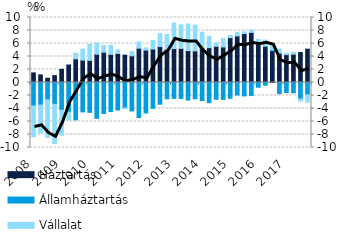
| Category | Háztartás | Államháztartás | Vállalat |
|---|---|---|---|
| 2008.0 | 1.482 | -3.614 | -4.726 |
| 2008.0 | 1.167 | -3.465 | -4.286 |
| 2008.0 | 0.647 | -2.667 | -5.769 |
| 2008.0 | 1.06 | -3.365 | -6.035 |
| 2009.0 | 2.022 | -4.26 | -3.85 |
| 2009.0 | 2.69 | -4.568 | -1.185 |
| 2009.0 | 3.646 | -5.737 | 0.861 |
| 2009.0 | 3.452 | -4.523 | 1.684 |
| 2010.0 | 3.403 | -4.596 | 2.463 |
| 2010.0 | 4.357 | -5.515 | 1.688 |
| 2010.0 | 4.662 | -4.769 | 1.012 |
| 2010.0 | 4.334 | -4.478 | 1.381 |
| 2011.0 | 4.471 | -4.232 | 0.537 |
| 2011.0 | 4.204 | -3.914 | -0.111 |
| 2011.0 | 4.109 | -4.378 | 0.654 |
| 2011.0 | 5.273 | -5.386 | 0.951 |
| 2012.0 | 4.99 | -4.694 | 0.332 |
| 2012.0 | 5.147 | -3.959 | 1.313 |
| 2012.0 | 5.529 | -3.339 | 1.965 |
| 2012.0 | 5.095 | -2.511 | 2.283 |
| 2013.0 | 5.217 | -2.438 | 3.935 |
| 2013.0 | 5.243 | -2.452 | 3.629 |
| 2013.0 | 4.902 | -2.704 | 4.105 |
| 2013.0 | 4.863 | -2.499 | 3.957 |
| 2014.0 | 5.255 | -2.784 | 2.466 |
| 2014.0 | 5.362 | -3.109 | 1.739 |
| 2014.0 | 5.569 | -2.575 | 0.494 |
| 2014.0 | 5.462 | -2.602 | 1.299 |
| 2015.0 | 6.893 | -2.428 | 0.355 |
| 2015.0 | 7.166 | -1.927 | 0.557 |
| 2015.0 | 7.531 | -2.068 | 0.277 |
| 2015.0 | 7.706 | -1.989 | 0.374 |
| 2016.0 | 5.929 | -0.728 | 0.691 |
| 2016.0 | 5.586 | -0.421 | 0.939 |
| 2016.0 | 4.885 | 0.128 | 0.799 |
| 2016.0 | 4.497 | -1.716 | 0.652 |
| 2017.0 | 4.289 | -1.527 | 0.212 |
| 2017.0 | 4.353 | -1.583 | 0.297 |
| 2017.0 | 4.616 | -2.543 | -0.327 |
| 2017.0 | 5.131 | -1.891 | -1.141 |